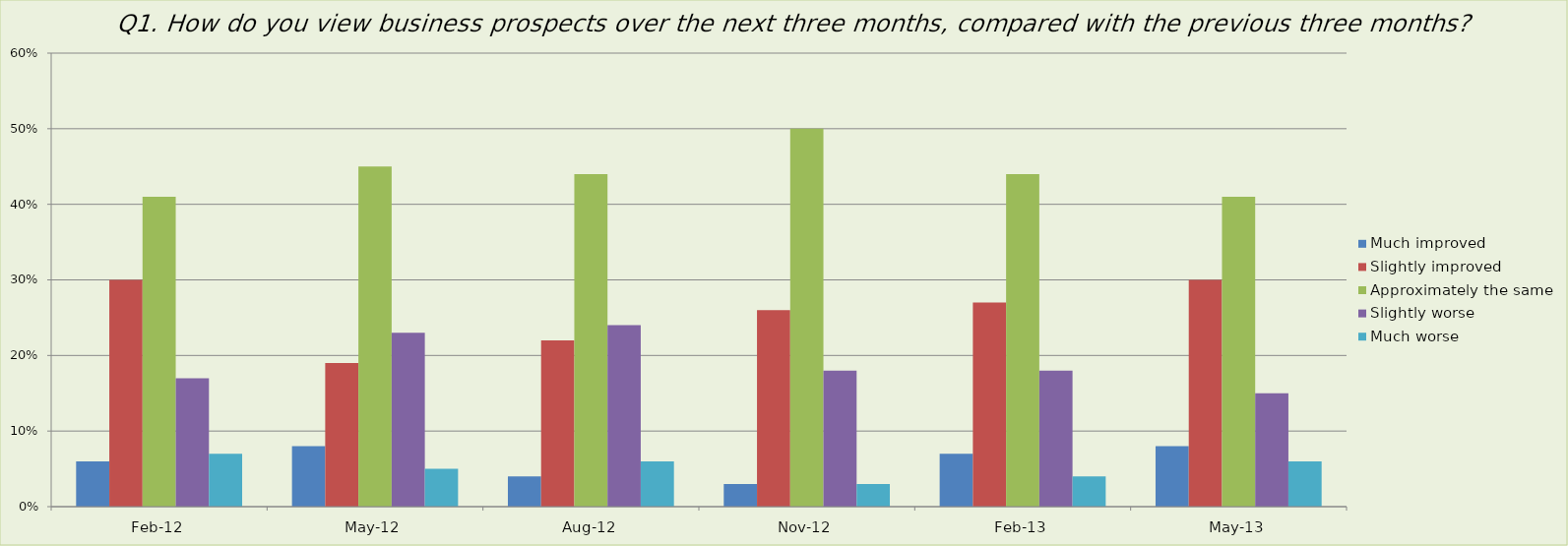
| Category | Much improved | Slightly improved | Approximately the same | Slightly worse | Much worse |
|---|---|---|---|---|---|
| 2012-02-01 | 0.06 | 0.3 | 0.41 | 0.17 | 0.07 |
| 2012-05-01 | 0.08 | 0.19 | 0.45 | 0.23 | 0.05 |
| 2012-08-01 | 0.04 | 0.22 | 0.44 | 0.24 | 0.06 |
| 2012-11-01 | 0.03 | 0.26 | 0.5 | 0.18 | 0.03 |
| 2013-02-01 | 0.07 | 0.27 | 0.44 | 0.18 | 0.04 |
| 2013-05-01 | 0.08 | 0.3 | 0.41 | 0.15 | 0.06 |